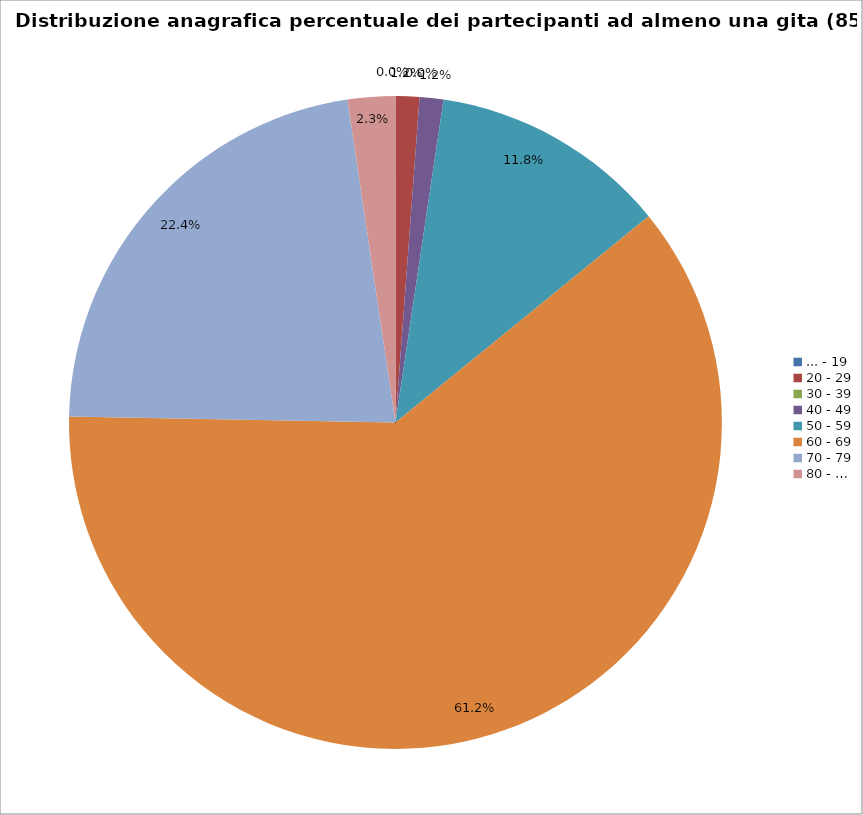
| Category | Nr. Tesserati |
|---|---|
| ... - 19 | 0 |
| 20 - 29 | 1 |
| 30 - 39 | 0 |
| 40 - 49 | 1 |
| 50 - 59 | 10 |
| 60 - 69 | 52 |
| 70 - 79 | 19 |
| 80 - … | 2 |